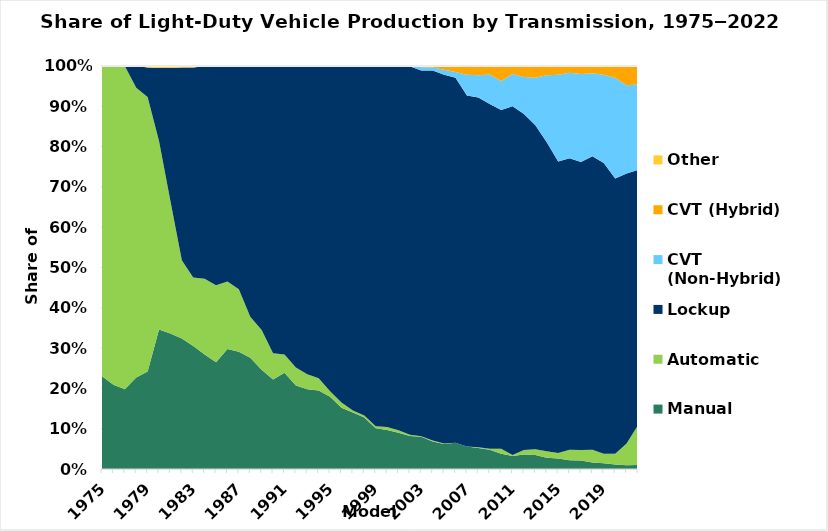
| Category | Manual | Automatic | Lockup | CVT (Non-Hybrid) | CVT (Hybrid) | Other |
|---|---|---|---|---|---|---|
| 1975.0 | 0.23 | 0.768 | 0.002 | 0 | 0 | 0 |
| 1976.0 | 0.209 | 0.791 | 0 | 0 | 0 | 0 |
| 1977.0 | 0.198 | 0.802 | 0 | 0 | 0 | 0 |
| 1978.0 | 0.227 | 0.719 | 0.055 | 0 | 0 | 0 |
| 1979.0 | 0.242 | 0.681 | 0.073 | 0 | 0 | 0.004 |
| 1980.0 | 0.346 | 0.468 | 0.181 | 0 | 0 | 0.005 |
| 1981.0 | 0.336 | 0.329 | 0.33 | 0 | 0 | 0.005 |
| 1982.0 | 0.324 | 0.194 | 0.478 | 0 | 0 | 0.004 |
| 1983.0 | 0.305 | 0.17 | 0.521 | 0 | 0 | 0.004 |
| 1984.0 | 0.284 | 0.188 | 0.528 | 0 | 0 | 0 |
| 1985.0 | 0.265 | 0.191 | 0.545 | 0 | 0 | 0 |
| 1986.0 | 0.298 | 0.167 | 0.535 | 0 | 0 | 0 |
| 1987.0 | 0.291 | 0.155 | 0.554 | 0 | 0 | 0 |
| 1988.0 | 0.276 | 0.102 | 0.622 | 0 | 0 | 0 |
| 1989.0 | 0.246 | 0.099 | 0.655 | 0.001 | 0 | 0 |
| 1990.0 | 0.222 | 0.065 | 0.712 | 0 | 0 | 0 |
| 1991.0 | 0.239 | 0.045 | 0.716 | 0 | 0 | 0 |
| 1992.0 | 0.207 | 0.045 | 0.748 | 0 | 0 | 0 |
| 1993.0 | 0.198 | 0.037 | 0.765 | 0 | 0 | 0 |
| 1994.0 | 0.195 | 0.03 | 0.776 | 0 | 0 | 0 |
| 1995.0 | 0.179 | 0.014 | 0.807 | 0 | 0 | 0 |
| 1996.0 | 0.152 | 0.013 | 0.835 | 0 | 0 | 0 |
| 1997.0 | 0.14 | 0.005 | 0.855 | 0 | 0 | 0 |
| 1998.0 | 0.128 | 0.005 | 0.867 | 0 | 0 | 0 |
| 1999.0 | 0.101 | 0.005 | 0.894 | 0 | 0 | 0 |
| 2000.0 | 0.097 | 0.007 | 0.895 | 0 | 0 | 0 |
| 2001.0 | 0.09 | 0.006 | 0.903 | 0 | 0.001 | 0 |
| 2002.0 | 0.082 | 0.003 | 0.914 | 0.001 | 0.001 | 0 |
| 2003.0 | 0.08 | 0.001 | 0.908 | 0.008 | 0.003 | 0 |
| 2004.0 | 0.068 | 0.003 | 0.918 | 0.007 | 0.004 | 0 |
| 2005.0 | 0.062 | 0.001 | 0.915 | 0.013 | 0.01 | 0 |
| 2006.0 | 0.065 | 0 | 0.906 | 0.014 | 0.015 | 0 |
| 2007.0 | 0.056 | 0 | 0.871 | 0.051 | 0.021 | 0 |
| 2008.0 | 0.052 | 0.002 | 0.868 | 0.055 | 0.024 | 0 |
| 2009.0 | 0.048 | 0.002 | 0.856 | 0.073 | 0.021 | 0 |
| 2010.0 | 0.038 | 0.012 | 0.841 | 0.072 | 0.038 | 0 |
| 2011.0 | 0.032 | 0.003 | 0.865 | 0.08 | 0.02 | 0 |
| 2012.0 | 0.036 | 0.011 | 0.834 | 0.092 | 0.027 | 0 |
| 2013.0 | 0.035 | 0.014 | 0.804 | 0.118 | 0.029 | 0 |
| 2014.0 | 0.028 | 0.016 | 0.767 | 0.166 | 0.023 | 0 |
| 2015.0 | 0.026 | 0.014 | 0.723 | 0.215 | 0.022 | 0 |
| 2016.0 | 0.022 | 0.026 | 0.723 | 0.212 | 0.017 | 0 |
| 2017.0 | 0.021 | 0.026 | 0.715 | 0.218 | 0.019 | 0 |
| 2018.0 | 0.016 | 0.032 | 0.728 | 0.206 | 0.017 | 0 |
| 2019.0 | 0.014 | 0.024 | 0.721 | 0.219 | 0.022 | 0 |
| 2020.0 | 0.011 | 0.027 | 0.683 | 0.25 | 0.028 | 0 |
| 2021.0 | 0.009 | 0.054 | 0.67 | 0.219 | 0.047 | 0 |
| 2022.0 | 0.01 | 0.099 | 0.633 | 0.212 | 0.046 | 0 |